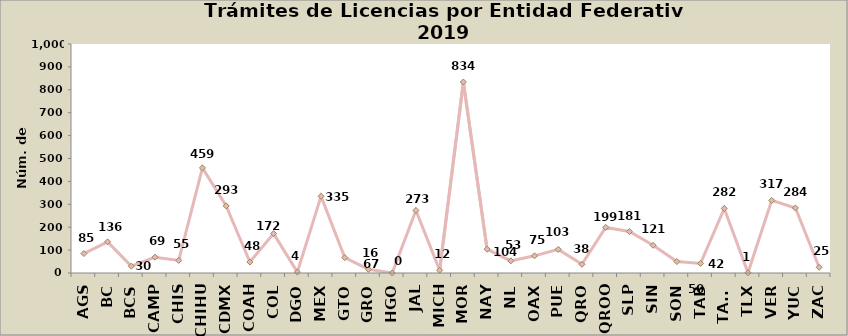
| Category | Series 0 |
|---|---|
| AGS | 85 |
| BC | 136 |
| BCS | 30 |
| CAMP | 69 |
| CHIS | 55 |
| CHIHU | 459 |
| CDMX | 293 |
| COAH | 48 |
| COL | 172 |
| DGO | 4 |
| MEX | 335 |
| GTO | 67 |
| GRO | 16 |
| HGO | 0 |
| JAL | 273 |
| MICH | 12 |
| MOR | 834 |
| NAY | 104 |
| NL | 53 |
| OAX | 75 |
| PUE | 103 |
| QRO | 38 |
| QROO | 199 |
| SLP | 181 |
| SIN | 121 |
| SON | 50 |
| TAB | 42 |
| TAMS | 282 |
| TLX | 1 |
| VER | 317 |
| YUC | 284 |
| ZAC | 25 |